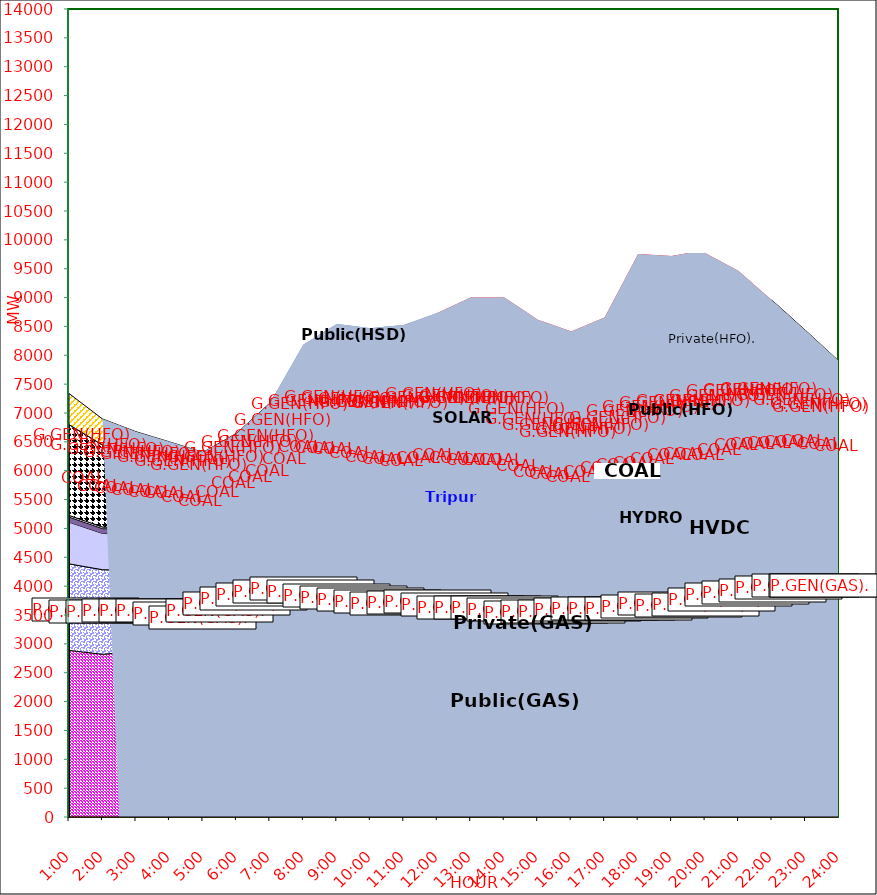
| Category | GAS | P.GEN(GAS). |  HVDC | TRIPURA | HYDRO | COAL | SOLAR | G.GEN(HFO) | P.GEN(HFO). | G.GEN(HSD) | P.GEN(HSD) | SHORTAGE | Total Energy Gen 196.533 MKWHr 
Energy Not Served   3.595 MKWHr 
Energy Requirement     200.128 MKWHr  |
|---|---|---|---|---|---|---|---|---|---|---|---|---|---|
| 1:00 | 2887 | 1499 | 722 | 88 | 30 | 1573 | 0 | 0 | 539 | 0 | 0 | 0 |  |
| 1:30 | 2853 | 1482.5 | 675 | 85 | 30 | 1497.5 | 0 | 0 | 494.5 | 0 | 0 | 0 |  |
| 2:00 | 2819 | 1466 | 628 | 82 | 30 | 1422 | 0 | 0 | 450 | 0 | 0 | 0 |  |
| 2:30 | 2843.5 | 1435 | 628 | 82 | 30 | 1372.5 | 0 | 0 | 395.5 | 0 | 0 | 0 |  |
| 3:00 | 2868 | 1404 | 628 | 82 | 30 | 1323 | 0 | 0 | 341 | 0 | 0 | 0 |  |
| 3:30 | 2871.5 | 1397.5 | 628 | 79 | 30 | 1284 | 0 | 0 | 298 | 0 | 0 | 0 |  |
| 4:00 | 2875 | 1391 | 628 | 76 | 30 | 1245 | 0 | 0 | 255 | 0 | 0 | 0 |  |
| 4:30 | 2838.5 | 1358.5 | 628 | 75 | 30 | 1245 | 0 | 0 | 234 | 0 | 0 | 0 |  |
| 5:00 | 2802 | 1326 | 628 | 74 | 30 | 1245 | 0 | 0 | 213 | 0 | 0 | 0 |  |
| 5:30 | 2872.5 | 1419.5 | 628 | 75 | 30 | 1224.5 | 0 | 0 | 232 | 0 | 0 | 0 |  |
| 6:00 | 2943 | 1513 | 628 | 76 | 30 | 1204 | 0 | 0 | 251 | 0 | 0 | 0 |  |
| 6:30 | 3001 | 1557 | 628 | 78 | 30 | 1203 | 2.5 | 8 | 400.5 | 0 | 0 | 0 |  |
| 7:00 | 3059 | 1601 | 628 | 80 | 30 | 1202 | 5 | 16 | 550 | 0 | 0 | 0 |  |
| 7:30 | 3073.5 | 1677 | 703.5 | 82 | 30 | 1280.5 | 32.5 | 24 | 718.5 | 0 | 55 | 0 |  |
| 8:00 | 3088 | 1753 | 779 | 84 | 30 | 1359 | 60 | 32 | 887 | 0 | 110 | 0 |  |
| 8:30 | 3032 | 1742 | 809.5 | 87 | 30 | 1399.5 | 97.5 | 55 | 942.5 | 0 | 168 | 0 |  |
| 9:00 | 2976 | 1731 | 840 | 90 | 30 | 1440 | 135 | 78 | 998 | 0 | 226 | 0 |  |
| 9:30 | 2947.5 | 1711 | 827.5 | 93 | 30 | 1416.5 | 178 | 80.5 | 995 | 0 | 227.5 | 0 |  |
| 10:00 | 2919 | 1691 | 815 | 96 | 30 | 1393 | 221 | 83 | 992 | 0 | 229 | 0 |  |
| 10:30 | 2887.5 | 1696.5 | 815 | 96 | 30 | 1368.5 | 253.5 | 101 | 1069 | 0 | 180 | 0 |  |
| 11:00 | 2856 | 1702 | 815 | 96 | 30 | 1344 | 286 | 119 | 1146 | 0 | 131 | 0 |  |
| 11:30 | 2874.5 | 1695.5 | 862.5 | 103 | 30 | 1319 | 309.5 | 141 | 1166 | 0 | 128 | 0 |  |
| 12:00 | 2893 | 1689 | 910 | 110 | 30 | 1294 | 333 | 163 | 1186 | 0 | 125 | 0 |  |
| 12:30 | 2842.5 | 1690.5 | 909.5 | 112 | 30 | 1298 | 334.5 | 166.5 | 1202 | 0 | 118.5 | 163.119 |  |
| 13:00 | 2792 | 1692 | 909 | 114 | 30 | 1302 | 336 | 170 | 1218 | 0 | 112 | 326.238 |  |
| 13:30 | 2792 | 1692 | 909 | 114 | 30 | 1302 | 336 | 170 | 1218 | 0 | 112 | 326.238 |  |
| 14:00 | 2792 | 1692 | 909 | 114 | 30 | 1302 | 336 | 170 | 1218 | 0 | 112 | 326.238 |  |
| 14:30 | 2779.5 | 1625.5 | 909 | 108 | 30 | 1272 | 268 | 183.5 | 1204 | 0 | 65 | 364.022 |  |
| 15:00 | 2767 | 1559 | 909 | 102 | 30 | 1242 | 200 | 197 | 1190 | 0 | 18 | 401.807 |  |
| 15:30 | 2799.5 | 1505.5 | 909.5 | 101 | 30 | 1201 | 147 | 200 | 1202.5 | 6.5 | 12.5 | 399.964 |  |
| 16:00 | 2832 | 1452 | 910 | 100 | 30 | 1160 | 94 | 203 | 1215 | 13 | 7 | 398.12 |  |
| 16:30 | 2826.5 | 1521.5 | 909.5 | 101 | 30 | 1189 | 55.5 | 211.5 | 1245 | 21 | 11.5 | 411.483 |  |
| 17:00 | 2821 | 1591 | 909 | 102 | 30 | 1218 | 17 | 220 | 1275 | 29 | 16 | 424.846 |  |
| 17:30 | 2811.5 | 1609.5 | 909 | 108 | 30 | 1273 | 8.5 | 337.5 | 1503 | 18 | 52.5 | 542.923 |  |
| 18:00 | 2802 | 1628 | 909 | 114 | 30 | 1328 | 0 | 455 | 1731 | 7 | 89 | 661 |  |
| 18:30 | 2838 | 1631 | 909 | 113 | 30 | 1379.5 | 0 | 412.5 | 1779 | 3.5 | 89 | 551.678 |  |
| 19:00 | 2874 | 1634 | 909 | 112 | 30 | 1431 | 0 | 370 | 1827 | 0 | 89 | 442.356 |  |
| 19:30 | 2819 | 1674 | 910 | 112 | 30 | 1495 | 0 | 363 | 1861 | 0 | 89 | 420.699 |  |
| 20:00 | 2902 | 1559 | 910 | 108 | 30 | 1530 | 0 | 369 | 1878 | 0 | 89 | 399.042 |  |
| 20:30 | 2983.5 | 1565.5 | 910 | 110 | 30 | 1524 | 0 | 367 | 1655.5 | 0 | 89 | 382.021 |  |
| 21:00 | 3065 | 1572 | 910 | 112 | 30 | 1518 | 0 | 365 | 1433 | 0 | 89 | 365 |  |
| 21:30 | 3110 | 1559.5 | 910 | 110 | 30 | 1502 | 0 | 365.5 | 1392 | 0 | 44.5 | 182.5 |  |
| 22:00 | 3155 | 1547 | 910 | 108 | 30 | 1486 | 0 | 366 | 1351 | 0 | 0 | 0 |  |
| 22:30 | 3195 | 1547.5 | 908.5 | 105 | 30 | 1444.5 | 0 | 185.5 | 1275.5 | 0 | 0 | 0 |  |
| 23:00 | 3235 | 1548 | 907 | 102 | 30 | 1403 | 0 | 5 | 1200 | 0 | 0 | 0 |  |
| 23:30 | 3223 | 1566 | 871.5 | 98 | 30 | 1377.5 | 0 | 2.5 | 995 | 0 | 0 | 0 |  |
| 24:00 | 3211 | 1584 | 836 | 94 | 30 | 1352 | 0 | 0 | 790 | 0 | 0 | 0 |  |